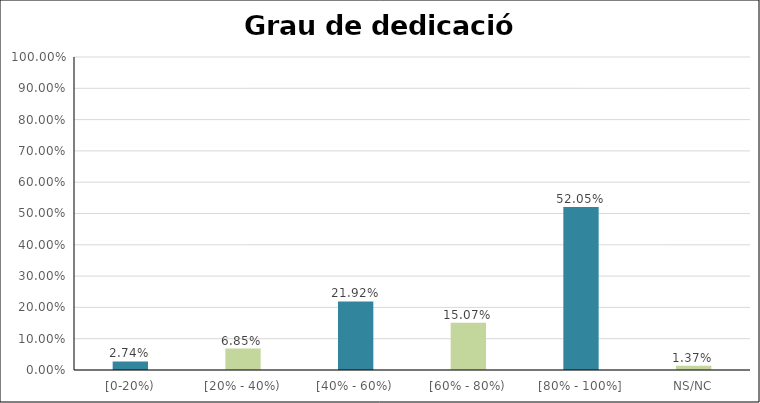
| Category | Series 0 |
|---|---|
| [0-20%) | 0.027 |
| [20% - 40%) | 0.068 |
| [40% - 60%) | 0.219 |
| [60% - 80%) | 0.151 |
| [80% - 100%] | 0.521 |
| NS/NC | 0.014 |